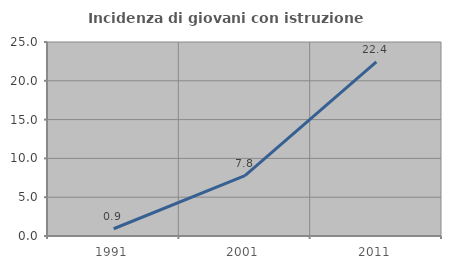
| Category | Incidenza di giovani con istruzione universitaria |
|---|---|
| 1991.0 | 0.935 |
| 2001.0 | 7.767 |
| 2011.0 | 22.449 |